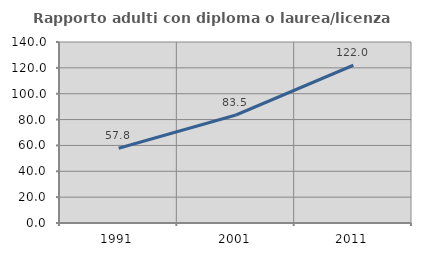
| Category | Rapporto adulti con diploma o laurea/licenza media  |
|---|---|
| 1991.0 | 57.792 |
| 2001.0 | 83.532 |
| 2011.0 | 122.014 |